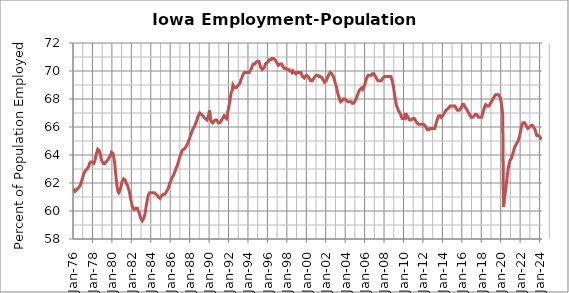
| Category | Series 1 |
|---|---|
| 1976-01-01 | 61.6 |
| 1976-02-01 | 61.5 |
| 1976-03-01 | 61.4 |
| 1976-04-01 | 61.4 |
| 1976-05-01 | 61.5 |
| 1976-06-01 | 61.6 |
| 1976-07-01 | 61.6 |
| 1976-08-01 | 61.7 |
| 1976-09-01 | 61.8 |
| 1976-10-01 | 61.9 |
| 1976-11-01 | 62.1 |
| 1976-12-01 | 62.3 |
| 1977-01-01 | 62.5 |
| 1977-02-01 | 62.7 |
| 1977-03-01 | 62.8 |
| 1977-04-01 | 62.9 |
| 1977-05-01 | 62.9 |
| 1977-06-01 | 63 |
| 1977-07-01 | 63 |
| 1977-08-01 | 63.2 |
| 1977-09-01 | 63.4 |
| 1977-10-01 | 63.5 |
| 1977-11-01 | 63.5 |
| 1977-12-01 | 63.5 |
| 1978-01-01 | 63.5 |
| 1978-02-01 | 63.4 |
| 1978-03-01 | 63.5 |
| 1978-04-01 | 63.7 |
| 1978-05-01 | 64 |
| 1978-06-01 | 64.2 |
| 1978-07-01 | 64.4 |
| 1978-08-01 | 64.4 |
| 1978-09-01 | 64.3 |
| 1978-10-01 | 64.1 |
| 1978-11-01 | 63.8 |
| 1978-12-01 | 63.6 |
| 1979-01-01 | 63.5 |
| 1979-02-01 | 63.4 |
| 1979-03-01 | 63.4 |
| 1979-04-01 | 63.4 |
| 1979-05-01 | 63.5 |
| 1979-06-01 | 63.5 |
| 1979-07-01 | 63.6 |
| 1979-08-01 | 63.7 |
| 1979-09-01 | 63.8 |
| 1979-10-01 | 63.9 |
| 1979-11-01 | 64 |
| 1979-12-01 | 64.2 |
| 1980-01-01 | 64.2 |
| 1980-02-01 | 64.1 |
| 1980-03-01 | 63.8 |
| 1980-04-01 | 63.4 |
| 1980-05-01 | 62.8 |
| 1980-06-01 | 62.2 |
| 1980-07-01 | 61.7 |
| 1980-08-01 | 61.4 |
| 1980-09-01 | 61.3 |
| 1980-10-01 | 61.4 |
| 1980-11-01 | 61.6 |
| 1980-12-01 | 61.8 |
| 1981-01-01 | 62.1 |
| 1981-02-01 | 62.2 |
| 1981-03-01 | 62.3 |
| 1981-04-01 | 62.3 |
| 1981-05-01 | 62.2 |
| 1981-06-01 | 62 |
| 1981-07-01 | 61.9 |
| 1981-08-01 | 61.8 |
| 1981-09-01 | 61.6 |
| 1981-10-01 | 61.4 |
| 1981-11-01 | 61.1 |
| 1981-12-01 | 60.8 |
| 1982-01-01 | 60.5 |
| 1982-02-01 | 60.3 |
| 1982-03-01 | 60.2 |
| 1982-04-01 | 60.1 |
| 1982-05-01 | 60.1 |
| 1982-06-01 | 60.2 |
| 1982-07-01 | 60.2 |
| 1982-08-01 | 60.2 |
| 1982-09-01 | 60 |
| 1982-10-01 | 59.9 |
| 1982-11-01 | 59.7 |
| 1982-12-01 | 59.5 |
| 1983-01-01 | 59.4 |
| 1983-02-01 | 59.3 |
| 1983-03-01 | 59.3 |
| 1983-04-01 | 59.5 |
| 1983-05-01 | 59.7 |
| 1983-06-01 | 60 |
| 1983-07-01 | 60.4 |
| 1983-08-01 | 60.7 |
| 1983-09-01 | 61 |
| 1983-10-01 | 61.2 |
| 1983-11-01 | 61.3 |
| 1983-12-01 | 61.3 |
| 1984-01-01 | 61.3 |
| 1984-02-01 | 61.3 |
| 1984-03-01 | 61.3 |
| 1984-04-01 | 61.3 |
| 1984-05-01 | 61.3 |
| 1984-06-01 | 61.3 |
| 1984-07-01 | 61.2 |
| 1984-08-01 | 61.2 |
| 1984-09-01 | 61.1 |
| 1984-10-01 | 61 |
| 1984-11-01 | 61 |
| 1984-12-01 | 60.9 |
| 1985-01-01 | 61 |
| 1985-02-01 | 61.1 |
| 1985-03-01 | 61.1 |
| 1985-04-01 | 61.2 |
| 1985-05-01 | 61.2 |
| 1985-06-01 | 61.2 |
| 1985-07-01 | 61.3 |
| 1985-08-01 | 61.3 |
| 1985-09-01 | 61.5 |
| 1985-10-01 | 61.6 |
| 1985-11-01 | 61.8 |
| 1985-12-01 | 62 |
| 1986-01-01 | 62.1 |
| 1986-02-01 | 62.3 |
| 1986-03-01 | 62.4 |
| 1986-04-01 | 62.5 |
| 1986-05-01 | 62.6 |
| 1986-06-01 | 62.8 |
| 1986-07-01 | 62.9 |
| 1986-08-01 | 63.1 |
| 1986-09-01 | 63.2 |
| 1986-10-01 | 63.4 |
| 1986-11-01 | 63.6 |
| 1986-12-01 | 63.8 |
| 1987-01-01 | 64 |
| 1987-02-01 | 64.1 |
| 1987-03-01 | 64.3 |
| 1987-04-01 | 64.3 |
| 1987-05-01 | 64.4 |
| 1987-06-01 | 64.4 |
| 1987-07-01 | 64.5 |
| 1987-08-01 | 64.6 |
| 1987-09-01 | 64.7 |
| 1987-10-01 | 64.8 |
| 1987-11-01 | 65 |
| 1987-12-01 | 65.1 |
| 1988-01-01 | 65.3 |
| 1988-02-01 | 65.5 |
| 1988-03-01 | 65.6 |
| 1988-04-01 | 65.8 |
| 1988-05-01 | 65.9 |
| 1988-06-01 | 66 |
| 1988-07-01 | 66.1 |
| 1988-08-01 | 66.3 |
| 1988-09-01 | 66.4 |
| 1988-10-01 | 66.6 |
| 1988-11-01 | 66.8 |
| 1988-12-01 | 66.9 |
| 1989-01-01 | 67 |
| 1989-02-01 | 67 |
| 1989-03-01 | 66.9 |
| 1989-04-01 | 66.9 |
| 1989-05-01 | 66.8 |
| 1989-06-01 | 66.7 |
| 1989-07-01 | 66.7 |
| 1989-08-01 | 66.6 |
| 1989-09-01 | 66.6 |
| 1989-10-01 | 66.5 |
| 1989-11-01 | 66.6 |
| 1989-12-01 | 66.6 |
| 1990-01-01 | 67.2 |
| 1990-02-01 | 66.6 |
| 1990-03-01 | 66.4 |
| 1990-04-01 | 66.4 |
| 1990-05-01 | 66.3 |
| 1990-06-01 | 66.4 |
| 1990-07-01 | 66.4 |
| 1990-08-01 | 66.5 |
| 1990-09-01 | 66.5 |
| 1990-10-01 | 66.5 |
| 1990-11-01 | 66.4 |
| 1990-12-01 | 66.3 |
| 1991-01-01 | 66.3 |
| 1991-02-01 | 66.3 |
| 1991-03-01 | 66.4 |
| 1991-04-01 | 66.5 |
| 1991-05-01 | 66.6 |
| 1991-06-01 | 66.7 |
| 1991-07-01 | 66.8 |
| 1991-08-01 | 66.7 |
| 1991-09-01 | 66.7 |
| 1991-10-01 | 66.6 |
| 1991-11-01 | 66.9 |
| 1991-12-01 | 67.2 |
| 1992-01-01 | 67.5 |
| 1992-02-01 | 67.8 |
| 1992-03-01 | 68.2 |
| 1992-04-01 | 68.5 |
| 1992-05-01 | 68.6 |
| 1992-06-01 | 69 |
| 1992-07-01 | 68.9 |
| 1992-08-01 | 68.8 |
| 1992-09-01 | 68.8 |
| 1992-10-01 | 68.8 |
| 1992-11-01 | 68.9 |
| 1992-12-01 | 68.9 |
| 1993-01-01 | 69 |
| 1993-02-01 | 69.1 |
| 1993-03-01 | 69.2 |
| 1993-04-01 | 69.4 |
| 1993-05-01 | 69.5 |
| 1993-06-01 | 69.7 |
| 1993-07-01 | 69.8 |
| 1993-08-01 | 69.9 |
| 1993-09-01 | 69.9 |
| 1993-10-01 | 69.9 |
| 1993-11-01 | 69.9 |
| 1993-12-01 | 69.9 |
| 1994-01-01 | 69.9 |
| 1994-02-01 | 69.9 |
| 1994-03-01 | 70 |
| 1994-04-01 | 70.1 |
| 1994-05-01 | 70.2 |
| 1994-06-01 | 70.4 |
| 1994-07-01 | 70.5 |
| 1994-08-01 | 70.5 |
| 1994-09-01 | 70.5 |
| 1994-10-01 | 70.6 |
| 1994-11-01 | 70.6 |
| 1994-12-01 | 70.7 |
| 1995-01-01 | 70.7 |
| 1995-02-01 | 70.7 |
| 1995-03-01 | 70.5 |
| 1995-04-01 | 70.3 |
| 1995-05-01 | 70.2 |
| 1995-06-01 | 70.1 |
| 1995-07-01 | 70.1 |
| 1995-08-01 | 70.2 |
| 1995-09-01 | 70.3 |
| 1995-10-01 | 70.5 |
| 1995-11-01 | 70.5 |
| 1995-12-01 | 70.6 |
| 1996-01-01 | 70.6 |
| 1996-02-01 | 70.7 |
| 1996-03-01 | 70.8 |
| 1996-04-01 | 70.8 |
| 1996-05-01 | 70.8 |
| 1996-06-01 | 70.9 |
| 1996-07-01 | 70.9 |
| 1996-08-01 | 70.9 |
| 1996-09-01 | 70.9 |
| 1996-10-01 | 70.8 |
| 1996-11-01 | 70.7 |
| 1996-12-01 | 70.6 |
| 1997-01-01 | 70.5 |
| 1997-02-01 | 70.4 |
| 1997-03-01 | 70.4 |
| 1997-04-01 | 70.5 |
| 1997-05-01 | 70.5 |
| 1997-06-01 | 70.5 |
| 1997-07-01 | 70.4 |
| 1997-08-01 | 70.3 |
| 1997-09-01 | 70.2 |
| 1997-10-01 | 70.2 |
| 1997-11-01 | 70.2 |
| 1997-12-01 | 70.2 |
| 1998-01-01 | 70.1 |
| 1998-02-01 | 70.1 |
| 1998-03-01 | 70.1 |
| 1998-04-01 | 70 |
| 1998-05-01 | 70 |
| 1998-06-01 | 70 |
| 1998-07-01 | 69.9 |
| 1998-08-01 | 70 |
| 1998-09-01 | 69.9 |
| 1998-10-01 | 69.9 |
| 1998-11-01 | 69.9 |
| 1998-12-01 | 69.8 |
| 1999-01-01 | 69.8 |
| 1999-02-01 | 69.9 |
| 1999-03-01 | 69.9 |
| 1999-04-01 | 69.9 |
| 1999-05-01 | 69.9 |
| 1999-06-01 | 69.9 |
| 1999-07-01 | 69.7 |
| 1999-08-01 | 69.6 |
| 1999-09-01 | 69.6 |
| 1999-10-01 | 69.5 |
| 1999-11-01 | 69.6 |
| 1999-12-01 | 69.6 |
| 2000-01-01 | 69.7 |
| 2000-02-01 | 69.7 |
| 2000-03-01 | 69.6 |
| 2000-04-01 | 69.5 |
| 2000-05-01 | 69.4 |
| 2000-06-01 | 69.3 |
| 2000-07-01 | 69.3 |
| 2000-08-01 | 69.3 |
| 2000-09-01 | 69.4 |
| 2000-10-01 | 69.5 |
| 2000-11-01 | 69.6 |
| 2000-12-01 | 69.6 |
| 2001-01-01 | 69.7 |
| 2001-02-01 | 69.7 |
| 2001-03-01 | 69.7 |
| 2001-04-01 | 69.6 |
| 2001-05-01 | 69.6 |
| 2001-06-01 | 69.6 |
| 2001-07-01 | 69.6 |
| 2001-08-01 | 69.5 |
| 2001-09-01 | 69.4 |
| 2001-10-01 | 69.3 |
| 2001-11-01 | 69.2 |
| 2001-12-01 | 69.2 |
| 2002-01-01 | 69.3 |
| 2002-02-01 | 69.4 |
| 2002-03-01 | 69.6 |
| 2002-04-01 | 69.7 |
| 2002-05-01 | 69.8 |
| 2002-06-01 | 69.9 |
| 2002-07-01 | 69.9 |
| 2002-08-01 | 69.8 |
| 2002-09-01 | 69.7 |
| 2002-10-01 | 69.6 |
| 2002-11-01 | 69.4 |
| 2002-12-01 | 69.2 |
| 2003-01-01 | 69 |
| 2003-02-01 | 68.8 |
| 2003-03-01 | 68.5 |
| 2003-04-01 | 68.3 |
| 2003-05-01 | 68.1 |
| 2003-06-01 | 67.9 |
| 2003-07-01 | 67.8 |
| 2003-08-01 | 67.8 |
| 2003-09-01 | 67.9 |
| 2003-10-01 | 68 |
| 2003-11-01 | 68 |
| 2003-12-01 | 68 |
| 2004-01-01 | 68 |
| 2004-02-01 | 67.9 |
| 2004-03-01 | 67.9 |
| 2004-04-01 | 67.8 |
| 2004-05-01 | 67.8 |
| 2004-06-01 | 67.8 |
| 2004-07-01 | 67.8 |
| 2004-08-01 | 67.8 |
| 2004-09-01 | 67.7 |
| 2004-10-01 | 67.7 |
| 2004-11-01 | 67.7 |
| 2004-12-01 | 67.8 |
| 2005-01-01 | 67.9 |
| 2005-02-01 | 68 |
| 2005-03-01 | 68.2 |
| 2005-04-01 | 68.3 |
| 2005-05-01 | 68.5 |
| 2005-06-01 | 68.6 |
| 2005-07-01 | 68.7 |
| 2005-08-01 | 68.7 |
| 2005-09-01 | 68.8 |
| 2005-10-01 | 68.7 |
| 2005-11-01 | 68.8 |
| 2005-12-01 | 68.9 |
| 2006-01-01 | 69.1 |
| 2006-02-01 | 69.3 |
| 2006-03-01 | 69.5 |
| 2006-04-01 | 69.6 |
| 2006-05-01 | 69.7 |
| 2006-06-01 | 69.7 |
| 2006-07-01 | 69.7 |
| 2006-08-01 | 69.7 |
| 2006-09-01 | 69.7 |
| 2006-10-01 | 69.8 |
| 2006-11-01 | 69.8 |
| 2006-12-01 | 69.8 |
| 2007-01-01 | 69.7 |
| 2007-02-01 | 69.6 |
| 2007-03-01 | 69.5 |
| 2007-04-01 | 69.4 |
| 2007-05-01 | 69.3 |
| 2007-06-01 | 69.3 |
| 2007-07-01 | 69.3 |
| 2007-08-01 | 69.3 |
| 2007-09-01 | 69.3 |
| 2007-10-01 | 69.4 |
| 2007-11-01 | 69.5 |
| 2007-12-01 | 69.5 |
| 2008-01-01 | 69.6 |
| 2008-02-01 | 69.6 |
| 2008-03-01 | 69.6 |
| 2008-04-01 | 69.6 |
| 2008-05-01 | 69.6 |
| 2008-06-01 | 69.6 |
| 2008-07-01 | 69.6 |
| 2008-08-01 | 69.6 |
| 2008-09-01 | 69.6 |
| 2008-10-01 | 69.4 |
| 2008-11-01 | 69.2 |
| 2008-12-01 | 68.9 |
| 2009-01-01 | 68.5 |
| 2009-02-01 | 68.1 |
| 2009-03-01 | 67.8 |
| 2009-04-01 | 67.5 |
| 2009-05-01 | 67.4 |
| 2009-06-01 | 67.2 |
| 2009-07-01 | 67.1 |
| 2009-08-01 | 67 |
| 2009-09-01 | 66.9 |
| 2009-10-01 | 66.7 |
| 2009-11-01 | 66.6 |
| 2009-12-01 | 66.6 |
| 2010-01-01 | 66.6 |
| 2010-02-01 | 66.8 |
| 2010-03-01 | 67 |
| 2010-04-01 | 66.7 |
| 2010-05-01 | 66.8 |
| 2010-06-01 | 66.7 |
| 2010-07-01 | 66.6 |
| 2010-08-01 | 66.5 |
| 2010-09-01 | 66.5 |
| 2010-10-01 | 66.5 |
| 2010-11-01 | 66.5 |
| 2010-12-01 | 66.6 |
| 2011-01-01 | 66.6 |
| 2011-02-01 | 66.6 |
| 2011-03-01 | 66.5 |
| 2011-04-01 | 66.5 |
| 2011-05-01 | 66.3 |
| 2011-06-01 | 66.3 |
| 2011-07-01 | 66.2 |
| 2011-08-01 | 66.2 |
| 2011-09-01 | 66.2 |
| 2011-10-01 | 66.2 |
| 2011-11-01 | 66.2 |
| 2011-12-01 | 66.2 |
| 2012-01-01 | 66.2 |
| 2012-02-01 | 66.2 |
| 2012-03-01 | 66.1 |
| 2012-04-01 | 66 |
| 2012-05-01 | 65.9 |
| 2012-06-01 | 65.8 |
| 2012-07-01 | 65.8 |
| 2012-08-01 | 65.8 |
| 2012-09-01 | 65.9 |
| 2012-10-01 | 65.9 |
| 2012-11-01 | 65.9 |
| 2012-12-01 | 65.9 |
| 2013-01-01 | 65.9 |
| 2013-02-01 | 65.9 |
| 2013-03-01 | 65.9 |
| 2013-04-01 | 66.1 |
| 2013-05-01 | 66.3 |
| 2013-06-01 | 66.5 |
| 2013-07-01 | 66.7 |
| 2013-08-01 | 66.8 |
| 2013-09-01 | 66.8 |
| 2013-10-01 | 66.8 |
| 2013-11-01 | 66.7 |
| 2013-12-01 | 66.7 |
| 2014-01-01 | 66.8 |
| 2014-02-01 | 66.9 |
| 2014-03-01 | 67 |
| 2014-04-01 | 67.1 |
| 2014-05-01 | 67.2 |
| 2014-06-01 | 67.2 |
| 2014-07-01 | 67.3 |
| 2014-08-01 | 67.3 |
| 2014-09-01 | 67.4 |
| 2014-10-01 | 67.5 |
| 2014-11-01 | 67.5 |
| 2014-12-01 | 67.5 |
| 2015-01-01 | 67.5 |
| 2015-02-01 | 67.5 |
| 2015-03-01 | 67.5 |
| 2015-04-01 | 67.5 |
| 2015-05-01 | 67.4 |
| 2015-06-01 | 67.3 |
| 2015-07-01 | 67.2 |
| 2015-08-01 | 67.2 |
| 2015-09-01 | 67.2 |
| 2015-10-01 | 67.2 |
| 2015-11-01 | 67.3 |
| 2015-12-01 | 67.4 |
| 2016-01-01 | 67.6 |
| 2016-02-01 | 67.6 |
| 2016-03-01 | 67.6 |
| 2016-04-01 | 67.5 |
| 2016-05-01 | 67.4 |
| 2016-06-01 | 67.3 |
| 2016-07-01 | 67.2 |
| 2016-08-01 | 67.1 |
| 2016-09-01 | 67.1 |
| 2016-10-01 | 66.9 |
| 2016-11-01 | 66.8 |
| 2016-12-01 | 66.7 |
| 2017-01-01 | 66.7 |
| 2017-02-01 | 66.7 |
| 2017-03-01 | 66.7 |
| 2017-04-01 | 66.8 |
| 2017-05-01 | 66.9 |
| 2017-06-01 | 66.9 |
| 2017-07-01 | 66.9 |
| 2017-08-01 | 66.8 |
| 2017-09-01 | 66.7 |
| 2017-10-01 | 66.7 |
| 2017-11-01 | 66.7 |
| 2017-12-01 | 66.7 |
| 2018-01-01 | 66.7 |
| 2018-02-01 | 66.9 |
| 2018-03-01 | 67.1 |
| 2018-04-01 | 67.3 |
| 2018-05-01 | 67.5 |
| 2018-06-01 | 67.6 |
| 2018-07-01 | 67.6 |
| 2018-08-01 | 67.5 |
| 2018-09-01 | 67.5 |
| 2018-10-01 | 67.5 |
| 2018-11-01 | 67.6 |
| 2018-12-01 | 67.7 |
| 2019-01-01 | 67.8 |
| 2019-02-01 | 67.9 |
| 2019-03-01 | 68 |
| 2019-04-01 | 68.1 |
| 2019-05-01 | 68.2 |
| 2019-06-01 | 68.3 |
| 2019-07-01 | 68.3 |
| 2019-08-01 | 68.3 |
| 2019-09-01 | 68.3 |
| 2019-10-01 | 68.3 |
| 2019-11-01 | 68.3 |
| 2019-12-01 | 68.1 |
| 2020-01-01 | 67.8 |
| 2020-02-01 | 67.4 |
| 2020-03-01 | 66.9 |
| 2020-04-01 | 60.3 |
| 2020-05-01 | 60.9 |
| 2020-06-01 | 61.2 |
| 2020-07-01 | 61.7 |
| 2020-08-01 | 62.2 |
| 2020-09-01 | 62.7 |
| 2020-10-01 | 63.1 |
| 2020-11-01 | 63.4 |
| 2020-12-01 | 63.6 |
| 2021-01-01 | 63.7 |
| 2021-02-01 | 63.8 |
| 2021-03-01 | 64 |
| 2021-04-01 | 64.2 |
| 2021-05-01 | 64.4 |
| 2021-06-01 | 64.6 |
| 2021-07-01 | 64.7 |
| 2021-08-01 | 64.8 |
| 2021-09-01 | 64.9 |
| 2021-10-01 | 65 |
| 2021-11-01 | 65.2 |
| 2021-12-01 | 65.4 |
| 2022-01-01 | 65.7 |
| 2022-02-01 | 66 |
| 2022-03-01 | 66.2 |
| 2022-04-01 | 66.3 |
| 2022-05-01 | 66.3 |
| 2022-06-01 | 66.3 |
| 2022-07-01 | 66.2 |
| 2022-08-01 | 66.1 |
| 2022-09-01 | 66 |
| 2022-10-01 | 65.9 |
| 2022-11-01 | 65.9 |
| 2022-12-01 | 66 |
| 2023-01-01 | 66 |
| 2023-02-01 | 66.1 |
| 2023-03-01 | 66.1 |
| 2023-04-01 | 66.1 |
| 2023-05-01 | 66.1 |
| 2023-06-01 | 65.9 |
| 2023-07-01 | 65.8 |
| 2023-08-01 | 65.6 |
| 2023-09-01 | 65.4 |
| 2023-10-01 | 65.4 |
| 2023-11-01 | 65.4 |
| 2023-12-01 | 65.4 |
| 2024-01-01 | 65.3 |
| 2024-02-01 | 65.2 |
| 2024-03-01 | 65.1 |